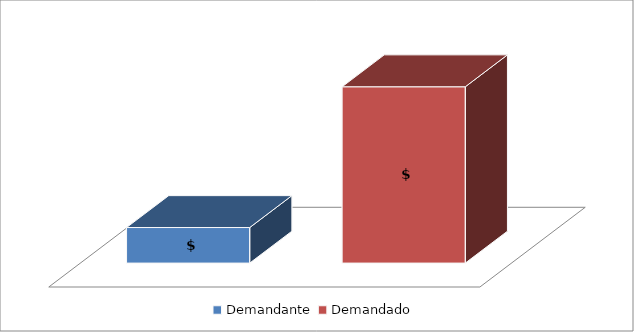
| Category | Series 0 |
|---|---|
| Demandante  | 73230982567 |
| Demandado  | 363024740342 |